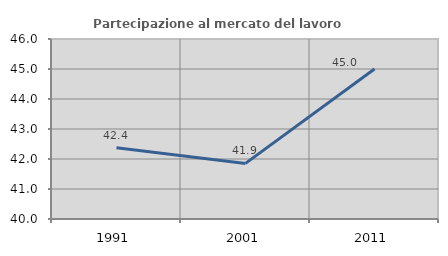
| Category | Partecipazione al mercato del lavoro  femminile |
|---|---|
| 1991.0 | 42.373 |
| 2001.0 | 41.853 |
| 2011.0 | 45 |